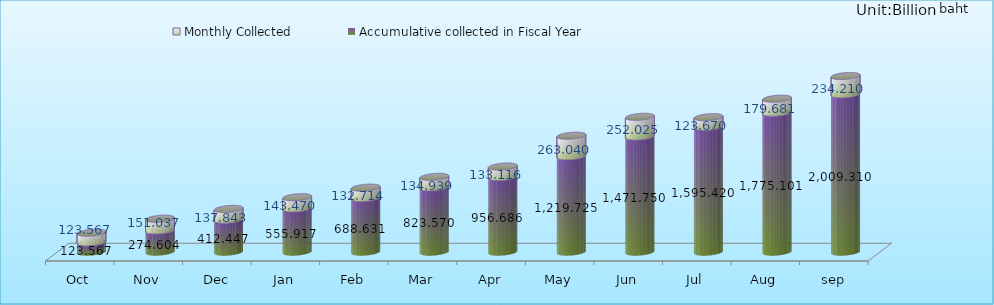
| Category | Accumulative collected in Fiscal Year | Monthly Collected |
|---|---|---|
| Oct | 123.567 | 123.567 |
| Nov | 274.604 | 151.037 |
| Dec | 412.447 | 137.843 |
| Jan | 555.917 | 143.47 |
| Feb | 688.631 | 132.714 |
| Mar | 823.57 | 134.939 |
| Apr | 956.686 | 133.116 |
| May | 1219.725 | 263.04 |
| Jun | 1471.75 | 252.025 |
| Jul | 1595.42 | 123.67 |
| Aug | 1775.101 | 179.681 |
| sep | 2009.31 | 234.21 |